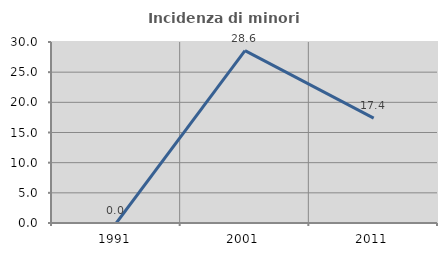
| Category | Incidenza di minori stranieri |
|---|---|
| 1991.0 | 0 |
| 2001.0 | 28.571 |
| 2011.0 | 17.391 |